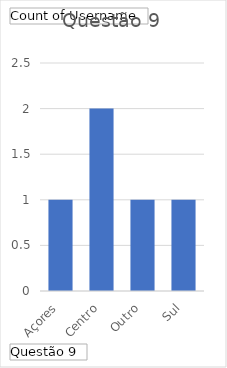
| Category | Total |
|---|---|
| Açores | 1 |
| Centro | 2 |
| Outro | 1 |
| Sul | 1 |